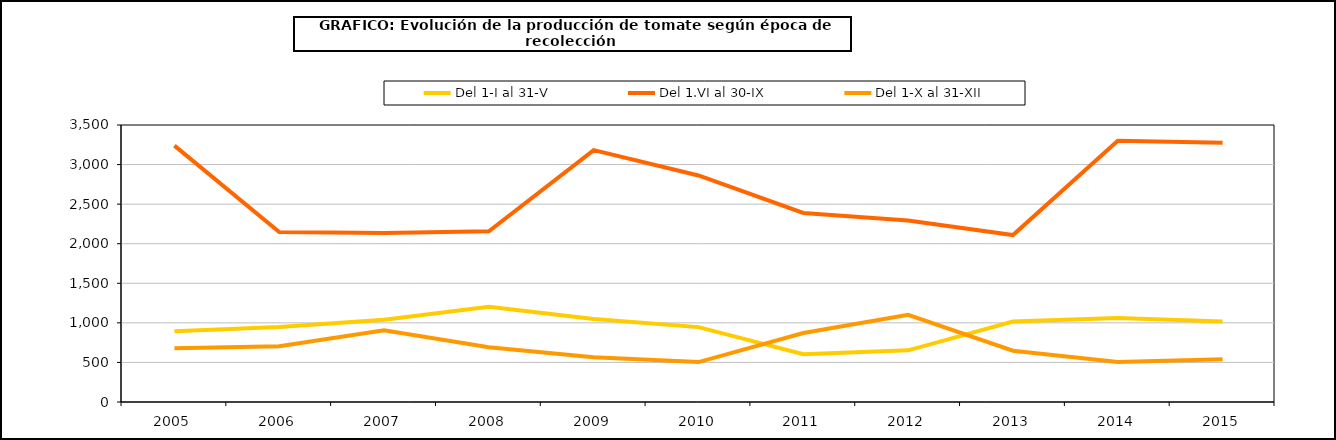
| Category | Del 1-I al 31-V | Del 1.VI al 30-IX | Del 1-X al 31-XII |
|---|---|---|---|
| 2005.0 | 893.191 | 3239.109 | 678.001 |
| 2006.0 | 947.775 | 2147.386 | 705.391 |
| 2007.0 | 1039.137 | 2134.825 | 907.515 |
| 2008.0 | 1201.903 | 2157.063 | 690.787 |
| 2009.0 | 1048.651 | 3182.545 | 566.857 |
| 2010.0 | 946.174 | 2862.288 | 504.247 |
| 2011.0 | 603.266 | 2389.177 | 871.679 |
| 2012.0 | 652.744 | 2292.602 | 1101.067 |
| 2013.0 | 1015.956 | 2108.99 | 647.9 |
| 2014.0 | 1061.306 | 3300.096 | 504.058 |
| 2015.0 | 1017.886 | 3275.48 | 539.334 |